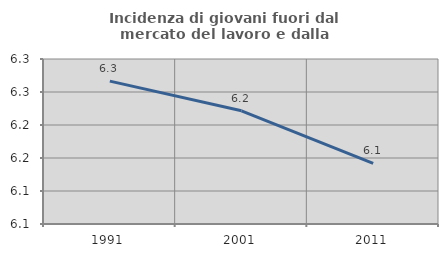
| Category | Incidenza di giovani fuori dal mercato del lavoro e dalla formazione  |
|---|---|
| 1991.0 | 6.267 |
| 2001.0 | 6.221 |
| 2011.0 | 6.142 |